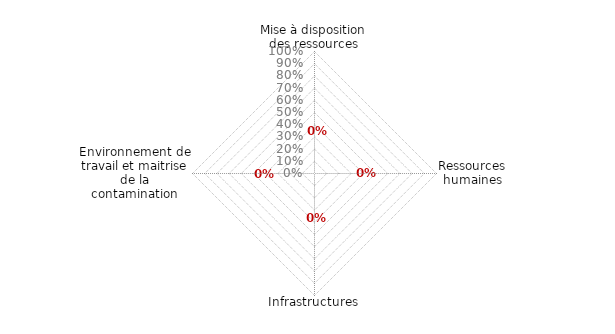
| Category | 6.4 Environnement de travail et maitrise de la contamination en attente |
|---|---|
| 0 | 0 |
| 1 | 0 |
| 2 | 0 |
| 3 | 0 |